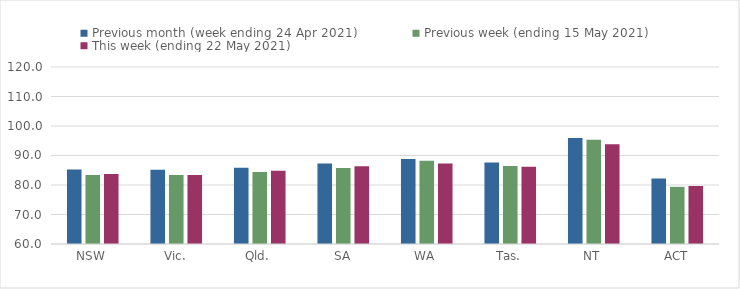
| Category | Previous month (week ending 24 Apr 2021) | Previous week (ending 15 May 2021) | This week (ending 22 May 2021) |
|---|---|---|---|
| NSW | 85.28 | 83.4 | 83.72 |
| Vic. | 85.17 | 83.35 | 83.41 |
| Qld. | 85.87 | 84.42 | 84.82 |
| SA | 87.3 | 85.79 | 86.32 |
| WA | 88.79 | 88.2 | 87.3 |
| Tas. | 87.65 | 86.43 | 86.2 |
| NT | 95.89 | 95.36 | 93.79 |
| ACT | 82.22 | 79.37 | 79.67 |